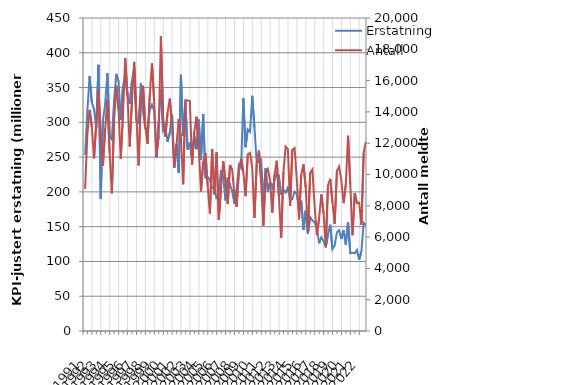
| Category | Erstatning |
|---|---|
| 1991.0 | 253.469 |
| nan | 315.36 |
| nan | 366.519 |
| nan | 328.269 |
| 1992.0 | 319.552 |
| nan | 291.981 |
| nan | 382.641 |
| nan | 189.775 |
| 1993.0 | 302.742 |
| nan | 326.193 |
| nan | 370.855 |
| nan | 280.025 |
| 1994.0 | 275.259 |
| nan | 331.438 |
| nan | 369.692 |
| nan | 358.663 |
| 1995.0 | 303.678 |
| nan | 351.299 |
| nan | 368.914 |
| nan | 337.816 |
| 1996.0 | 326.588 |
| nan | 358.519 |
| nan | 378.266 |
| nan | 302.415 |
| 1997.0 | 298.989 |
| nan | 356.113 |
| nan | 315.206 |
| nan | 291.396 |
| 1998.0 | 289.223 |
| nan | 317.273 |
| nan | 325.337 |
| nan | 316.584 |
| 1999.0 | 248.708 |
| nan | 301.782 |
| nan | 346.828 |
| nan | 287.664 |
| 2000.0 | 293.228 |
| nan | 271.936 |
| nan | 285.248 |
| nan | 311.846 |
| 2001.0 | 234.505 |
| nan | 268.968 |
| nan | 227.131 |
| nan | 368.386 |
| 2002.0 | 280.478 |
| nan | 328.826 |
| nan | 260.77 |
| nan | 270.739 |
| 2003.0 | 247.365 |
| nan | 280.296 |
| nan | 261.363 |
| nan | 303.899 |
| 2004.0 | 246.119 |
| nan | 312.001 |
| nan | 220.435 |
| nan | 221.355 |
| 2005.0 | 217.579 |
| nan | 205.064 |
| nan | 205.915 |
| nan | 189.628 |
| 2006.0 | 200.078 |
| nan | 231.376 |
| nan | 220.674 |
| nan | 187.581 |
| 2007.0 | 220.694 |
| nan | 210.821 |
| nan | 201.064 |
| nan | 183.119 |
| 2008.0 | 203.451 |
| nan | 239.218 |
| nan | 234.438 |
| nan | 334.908 |
| 2009.0 | 264.21 |
| nan | 289.974 |
| nan | 286.344 |
| nan | 338.202 |
| 2010.0 | 292.603 |
| nan | 242.276 |
| nan | 243.27 |
| nan | 246.171 |
| 2011.0 | 186.198 |
| nan | 233.898 |
| nan | 200.278 |
| nan | 214.975 |
| 2012.0 | 206.705 |
| nan | 216.668 |
| nan | 226.437 |
| nan | 223.463 |
| 2013.0 | 195.495 |
| nan | 203.199 |
| nan | 199.023 |
| nan | 206.2 |
| 2014.0 | 188.402 |
| nan | 189.607 |
| nan | 200.172 |
| nan | 197.056 |
| 2015.0 | 173.901 |
| nan | 187.368 |
| nan | 145.441 |
| nan | 173.337 |
| 2016.0 | 139.594 |
| nan | 163.833 |
| nan | 159.014 |
| nan | 156.137 |
| 2017.0 | 149.352 |
| nan | 126.055 |
| nan | 134.611 |
| nan | 129.438 |
| 2018.0 | 120.035 |
| nan | 139.312 |
| nan | 152.844 |
| nan | 117.524 |
| 2019.0 | 123.081 |
| nan | 141.817 |
| nan | 144.981 |
| nan | 132.183 |
| 2020.0 | 145.263 |
| nan | 124.327 |
| nan | 156.564 |
| nan | 111.962 |
| 2021.0 | 112.429 |
| nan | 111.632 |
| nan | 116.581 |
| nan | 102.588 |
| 2022.0 | 114.516 |
| nan | 155.702 |
| nan | 152.016 |